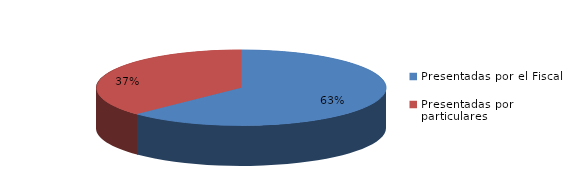
| Category | Series 0 |
|---|---|
| Presentadas por el Fiscal | 138 |
| Presentadas por particulares | 82 |